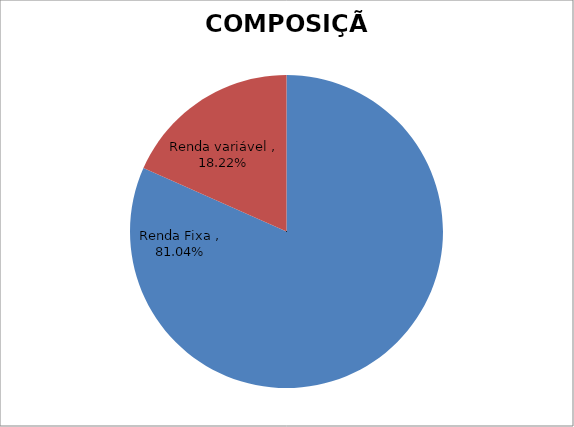
| Category | Series 0 |
|---|---|
| Renda Fixa  | 0.81 |
| Renda variável  | 0.182 |